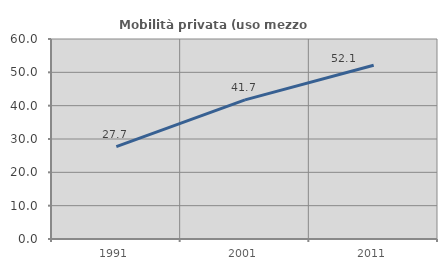
| Category | Mobilità privata (uso mezzo privato) |
|---|---|
| 1991.0 | 27.734 |
| 2001.0 | 41.731 |
| 2011.0 | 52.141 |